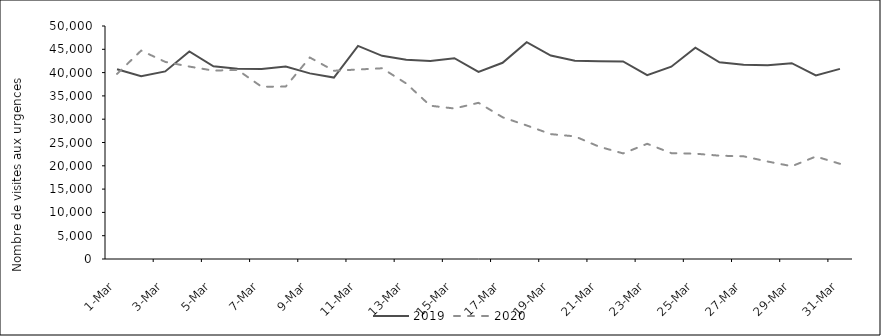
| Category | 2019 | 2020 |
|---|---|---|
| 2020-03-01 | 40725 | 39728 |
| 2020-03-02 | 39231 | 44727 |
| 2020-03-03 | 40253 | 42299 |
| 2020-03-04 | 44558 | 41294 |
| 2020-03-05 | 41366 | 40425 |
| 2020-03-06 | 40842 | 40576 |
| 2020-03-07 | 40799 | 36965 |
| 2020-03-08 | 41320 | 36997 |
| 2020-03-09 | 39831 | 43240 |
| 2020-03-10 | 38927 | 40399 |
| 2020-03-11 | 45719 | 40662 |
| 2020-03-12 | 43598 | 40926 |
| 2020-03-13 | 42761 | 37668 |
| 2020-03-14 | 42465 | 32888 |
| 2020-03-15 | 43086 | 32300 |
| 2020-03-16 | 40144 | 33515 |
| 2020-03-17 | 42107 | 30416 |
| 2020-03-18 | 46537 | 28659 |
| 2020-03-19 | 43660 | 26797 |
| 2020-03-20 | 42560 | 26318 |
| 2020-03-21 | 42436 | 24114 |
| 2020-03-22 | 42393 | 22657 |
| 2020-03-23 | 39446 | 24724 |
| 2020-03-24 | 41268 | 22719 |
| 2020-03-25 | 45332 | 22598 |
| 2020-03-26 | 42219 | 22174 |
| 2020-03-27 | 41704 | 22037 |
| 2020-03-28 | 41590 | 20918 |
| 2020-03-29 | 42026 | 19906 |
| 2020-03-30 | 39404 | 21996 |
| 2020-03-31 | 40803 | 20427 |